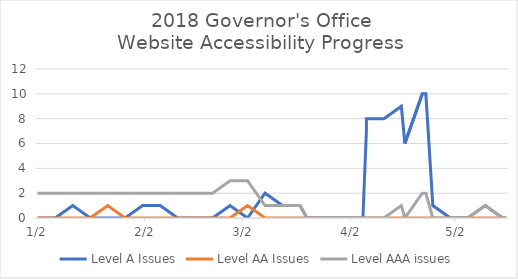
| Category | Level A Issues | Level AA Issues | Level AAA issues |
|---|---|---|---|
| 2018-01-02 22:25:20 | 0 | 0 | 2 |
| 2018-01-07 22:03:56 | 0 | 0 | 2 |
| 2018-01-12 21:57:15 | 1 | 0 | 2 |
| 2018-01-17 23:21:51 | 0 | 0 | 2 |
| 2018-01-22 21:57:46 | 0 | 1 | 2 |
| 2018-01-27 22:15:01 | 0 | 0 | 2 |
| 2018-02-01 22:00:35 | 1 | 0 | 2 |
| 2018-02-06 22:40:51 | 1 | 0 | 2 |
| 2018-02-11 22:20:39 | 0 | 0 | 2 |
| 2018-02-16 22:50:01 | 0 | 0 | 2 |
| 2018-02-21 23:03:38 | 0 | 0 | 2 |
| 2018-02-26 22:15:38 | 1 | 0 | 3 |
| 2018-03-03 22:06:04 | 0 | 1 | 3 |
| 2018-03-08 21:44:29 | 2 | 0 | 1 |
| 2018-03-13 22:46:26 | 1 | 0 | 1 |
| 2018-03-18 22:40:17 | 1 | 0 | 1 |
| 2018-03-20 13:32:33 | 0 | 0 | 0 |
| 2018-03-24 23:40:22 | 0 | 0 | 0 |
| 2018-03-29 22:13:19 | 0 | 0 | 0 |
| 2018-04-03 21:46:44 | 0 | 0 | 0 |
| 2018-04-05 11:30:35 | 0 | 0 | 0 |
| 2018-04-06 09:36:35 | 7 | 0 | 0 |
| 2018-04-06 15:12:26 | 8 | 0 | 0 |
| 2018-04-11 00:09:31 | 8 | 0 | 0 |
| 2018-04-16 00:57:18 | 9 | 0 | 1 |
| 2018-04-17 12:21:40 | 6 | 0 | 0 |
| 2018-04-17 15:32:23 | 6 | 0 | 0 |
| 2018-04-22 00:57:06 | 10 | 0 | 2 |
| 2018-04-23 07:28:14 | 10 | 0 | 2 |
| 2018-04-25 10:39:19 | 1 | 0 | 0 |
| 2018-04-30 00:49:09 | 0 | 0 | 0 |
| 2018-05-05 00:20:32 | 0 | 0 | 0 |
| 2018-05-10 00:47:22 | 1 | 0 | 1 |
| 2018-05-15 00:42:45 | 0 | 0 | 0 |
| 2018-05-16 01:09:22 | 0 | 0 | 0 |